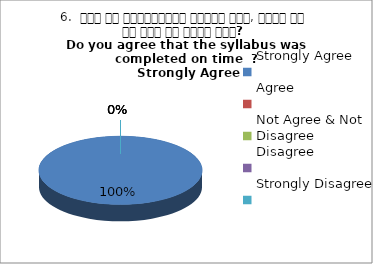
| Category | 6.  समय पर पाठ्यक्रम पूर्ण हुआ, क्या आप इस बात से सहमत हैं? 
Do you agree that the syllabus was completed on time  ?
 Strongly Agree |
|---|---|
| Strongly Agree | 1 |
| Agree | 0 |
| Not Agree & Not Disagree | 0 |
| Disagree | 0 |
| Strongly Disagree | 0 |